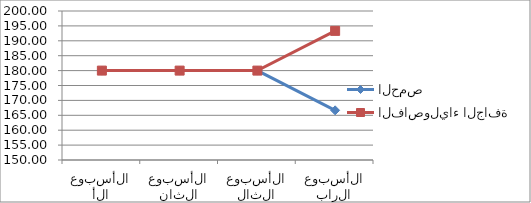
| Category | الحمص | الفاصولياء الجافة |
|---|---|---|
| 0 | 180 | 180 |
| 1 | 180 | 180 |
| 2 | 180 | 180 |
| 3 | 166.66 | 193.33 |